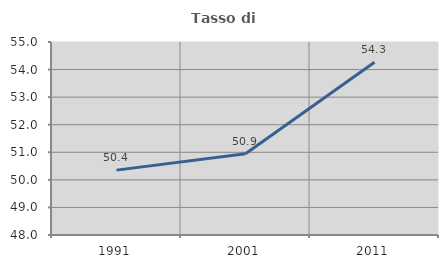
| Category | Tasso di occupazione   |
|---|---|
| 1991.0 | 50.353 |
| 2001.0 | 50.945 |
| 2011.0 | 54.264 |